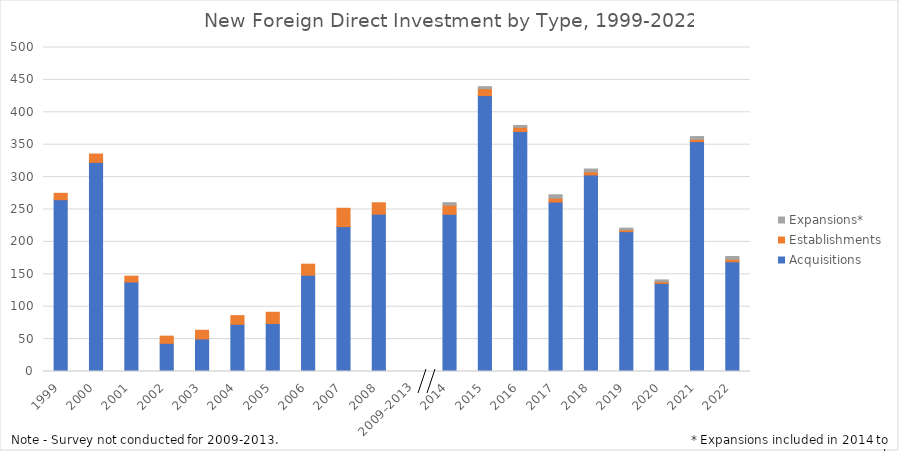
| Category | Acquisitions | Establishments | Expansions* |
|---|---|---|---|
| 1999 | 265.127 | 9.829 | 0 |
| 2000 | 322.703 | 12.926 | 0 |
| 2001 | 138.091 | 9.017 | 0 |
| 2002 | 43.442 | 11.077 | 0 |
| 2003 | 50.212 | 13.379 | 0 |
| 2004 | 72.738 | 13.481 | 0 |
| 2005 | 73.997 | 17.393 | 0 |
| 2006 | 148.604 | 16.999 | 0 |
| 2007 | 223.616 | 28.301 | 0 |
| 2008 | 242.799 | 17.564 | 0 |
| 2009–2013 | 0 | 0 | 0 |
| 2014 | 242.58 | 14.183 | 3.724 |
| 2015 | 425.788 | 10.739 | 3.037 |
| 2016 | 370.317 | 6.504 | 2.907 |
| 2017 | 261.455 | 6.044 | 5.257 |
| 2018 | 303.334 | 4.88 | 4.241 |
| 2019 | 215.847 | 2.728 | 2.64 |
| 2020 | 135.919 | 2.623 | 2.829 |
| 2021 | 354.817 | 3.553 | 4.186 |
| 2022 | 169.36 | 3.771 | 4.362 |